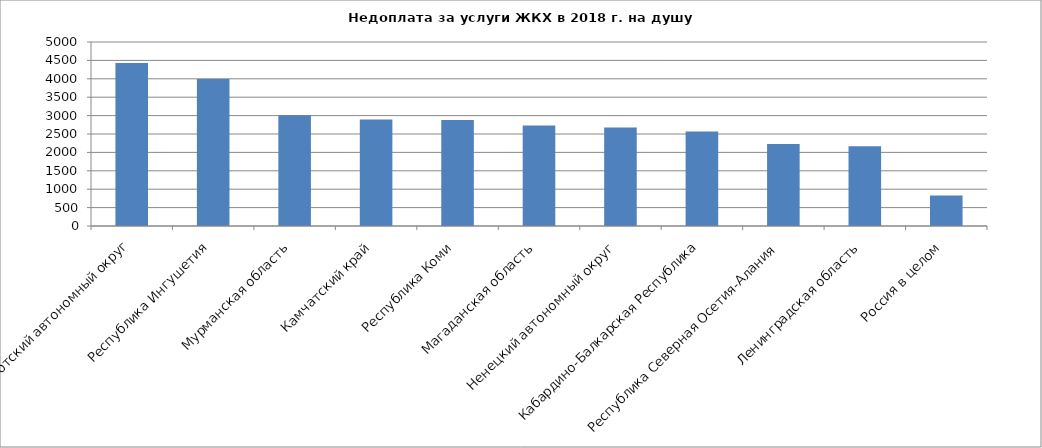
| Category | Недоплата за услуги ЖКХ в 2018 г. на душу населения, руб. |
|---|---|
| Чукотский автономный округ | 4429.291 |
| Республика Ингушетия | 3995.246 |
| Мурманская область | 3010.579 |
| Камчатский край | 2891.136 |
| Республика Коми | 2879.003 |
| Магаданская область | 2728.744 |
| Ненецкий автономный округ | 2673.559 |
| Кабардино-Балкарская Республика | 2565.213 |
| Республика Северная Осетия-Алания | 2225.751 |
| Ленинградская область | 2167.898 |
| Россия в целом | 826 |